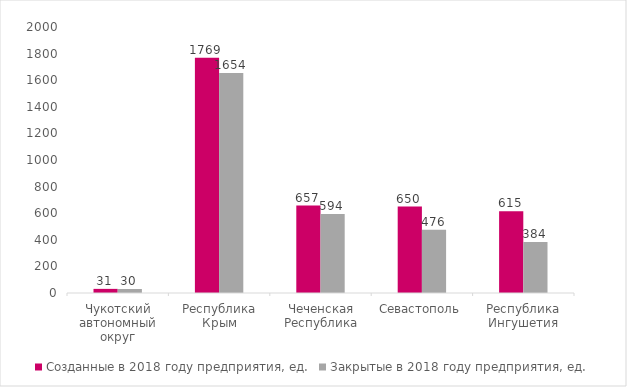
| Category | Созданные в 2018 году предприятия, ед. | Закрытые в 2018 году предприятия, ед. |
|---|---|---|
| Чукотский автономный округ | 31 | 30 |
| Республика Крым | 1769 | 1654 |
| Чеченская Республика | 657 | 594 |
| Севастополь | 650 | 476 |
| Республика Ингушетия | 615 | 384 |